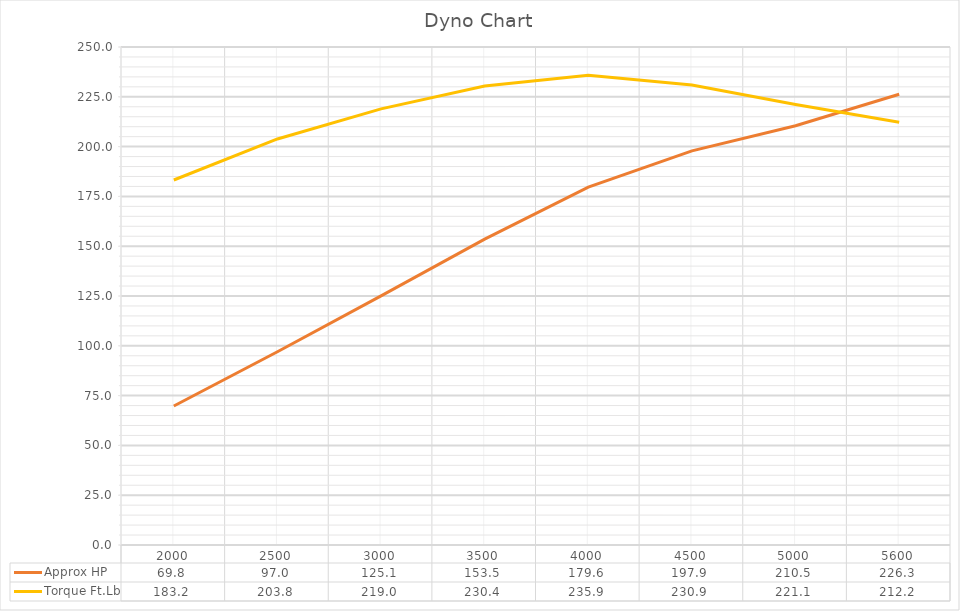
| Category | Approx HP | Torque Ft.Lb |
|---|---|---|
| 2000.0 | 69.775 | 183.232 |
| 2500.0 | 97.028 | 203.841 |
| 3000.0 | 125.07 | 218.961 |
| 3500.0 | 153.528 | 230.385 |
| 4000.0 | 179.64 | 235.873 |
| 4500.0 | 197.873 | 230.945 |
| 5000.0 | 210.476 | 221.089 |
| 5600.0 | 226.299 | 212.241 |